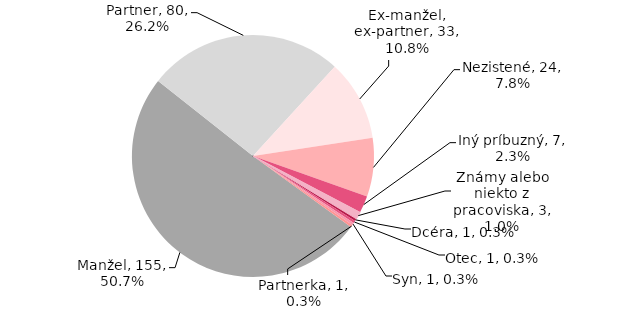
| Category | Series 0 |
|---|---|
| Manžel | 155 |
| Partner | 80 |
| Ex-manžel, ex-partner | 33 |
| Nezistené | 24 |
| Iný príbuzný | 7 |
| Známy alebo niekto z pracoviska | 3 |
| Dcéra | 1 |
| Otec | 1 |
| Syn | 1 |
| Partnerka | 1 |